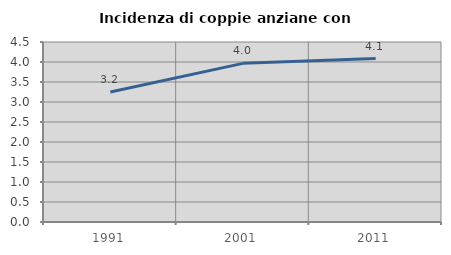
| Category | Incidenza di coppie anziane con figli |
|---|---|
| 1991.0 | 3.249 |
| 2001.0 | 3.966 |
| 2011.0 | 4.087 |